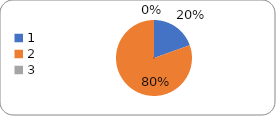
| Category | Series 0 |
|---|---|
| 0 | 24 |
| 1 | 99 |
| 2 | 0 |